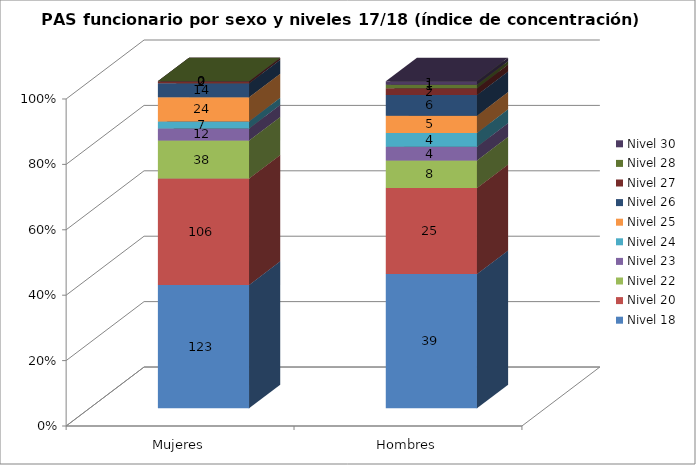
| Category | Nivel 18 | Nivel 20 | Nivel 22 | Nivel 23 | Nivel 24 | Nivel 25 | Nivel 26 | Nivel 27 | Nivel 28 | Nivel 30 |
|---|---|---|---|---|---|---|---|---|---|---|
| Mujeres | 123 | 106 | 38 | 12 | 7 | 24 | 14 | 2 | 0 | 0 |
| Hombres | 39 | 25 | 8 | 4 | 4 | 5 | 6 | 2 | 1 | 1 |